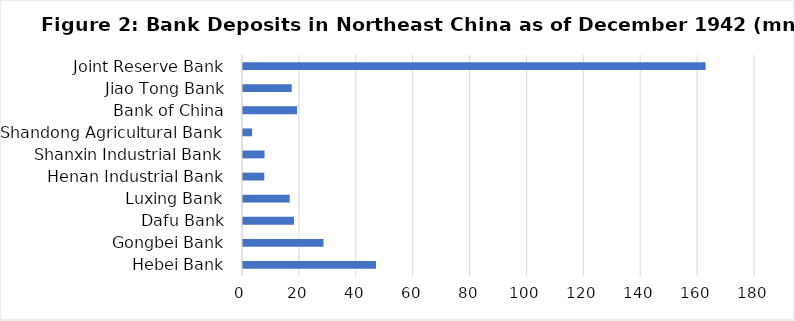
| Category | Deposits |
|---|---|
| Hebei Bank | 46770 |
| Gongbei Bank | 28315 |
| Dafu Bank | 17916 |
| Luxing Bank | 16418 |
| Henan Industrial Bank | 7482 |
| Shanxin Industrial Bank | 7573 |
| Shandong Agricultural Bank | 3196 |
| Bank of China | 19013 |
| Jiao Tong Bank | 17140 |
| Joint Reserve Bank | 162628 |